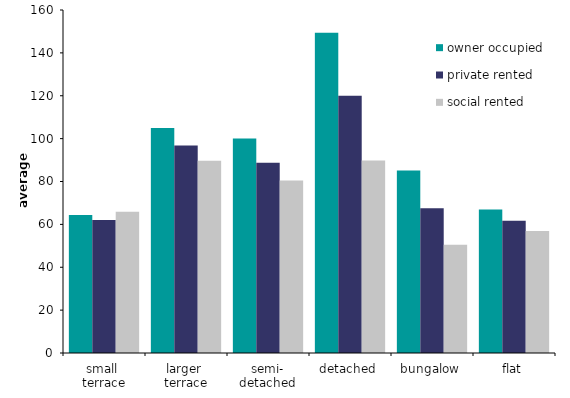
| Category | owner occupied | private rented | social rented |
|---|---|---|---|
| small 
terrace | 64.315 | 62.029 | 65.834 |
| larger 
terrace | 104.95 | 96.794 | 89.716 |
| semi-
detached | 100.083 | 88.778 | 80.437 |
| detached | 149.417 | 119.964 | 89.848 |
| bungalow | 85.099 | 67.58 | 50.489 |
| flat | 66.969 | 61.72 | 56.905 |